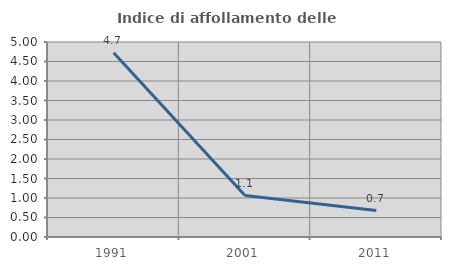
| Category | Indice di affollamento delle abitazioni  |
|---|---|
| 1991.0 | 4.726 |
| 2001.0 | 1.061 |
| 2011.0 | 0.677 |